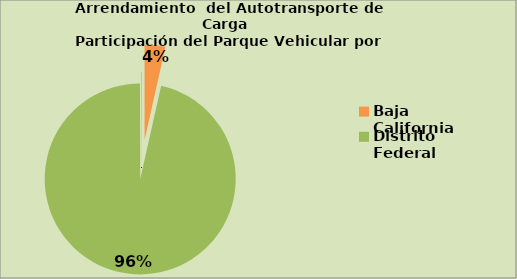
| Category | Series 0 |
|---|---|
| Baja California | 3.516 |
| Chihuahua | 0.003 |
| Distrito Federal | 96.43 |
| Nuevo León | 0.03 |
| Quintana Roo | 0.021 |